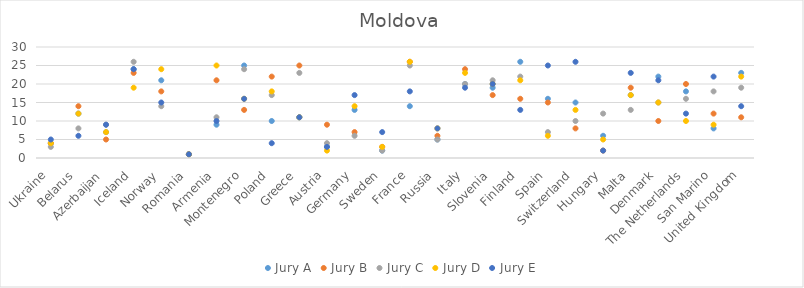
| Category | Jury A | Jury B | Jury C | Jury D | Jury E |
|---|---|---|---|---|---|
| Ukraine | 4 | 4 | 3 | 4 | 5 |
| Belarus | 12 | 14 | 8 | 12 | 6 |
| Azerbaijan | 7 | 5 | 9 | 7 | 9 |
| Iceland | 24 | 23 | 26 | 19 | 24 |
| Norway | 21 | 18 | 14 | 24 | 15 |
| Romania | 1 | 1 | 1 | 1 | 1 |
| Armenia | 9 | 21 | 11 | 25 | 10 |
| Montenegro | 25 | 13 | 24 | 16 | 16 |
| Poland | 10 | 22 | 17 | 18 | 4 |
| Greece | 11 | 25 | 23 | 11 | 11 |
| Austria | 3 | 9 | 4 | 2 | 3 |
| Germany | 13 | 7 | 6 | 14 | 17 |
| Sweden | 2 | 3 | 2 | 3 | 7 |
| France | 14 | 26 | 25 | 26 | 18 |
| Russia | 5 | 6 | 5 | 8 | 8 |
| Italy | 20 | 24 | 20 | 23 | 19 |
| Slovenia | 19 | 17 | 21 | 20 | 20 |
| Finland | 26 | 16 | 22 | 21 | 13 |
| Spain | 16 | 15 | 7 | 6 | 25 |
| Switzerland | 15 | 8 | 10 | 13 | 26 |
| Hungary | 6 | 2 | 12 | 5 | 2 |
| Malta | 17 | 19 | 13 | 17 | 23 |
| Denmark | 22 | 10 | 15 | 15 | 21 |
| The Netherlands | 18 | 20 | 16 | 10 | 12 |
| San Marino | 8 | 12 | 18 | 9 | 22 |
| United Kingdom | 23 | 11 | 19 | 22 | 14 |